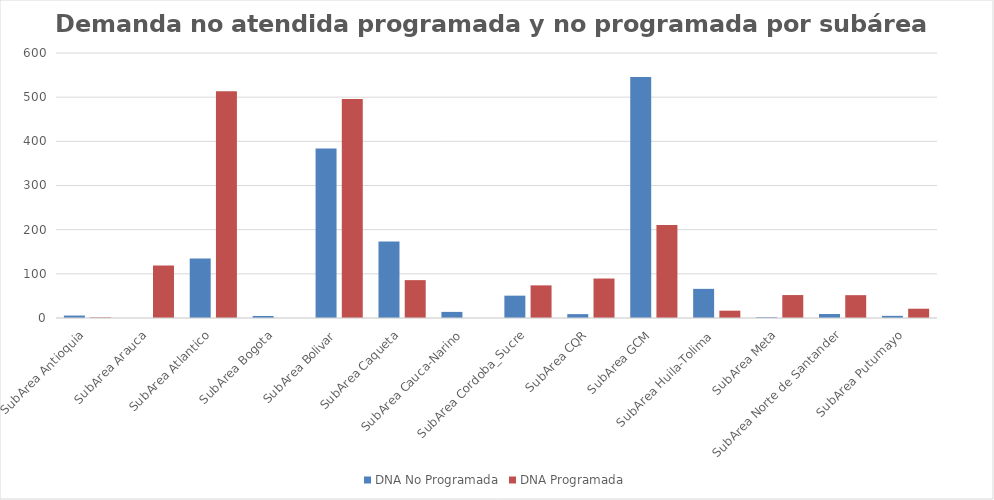
| Category | DNA No Programada | DNA Programada |
|---|---|---|
| SubArea Antioquia | 5.54 | 1.37 |
| SubArea Arauca | 0 | 118.94 |
| SubArea Atlantico | 134.89 | 513.29 |
| SubArea Bogota | 4.6 | 0 |
| SubArea Bolivar | 383.52 | 496.02 |
| SubArea Caqueta | 173.28 | 85.75 |
| SubArea Cauca-Narino | 13.81 | 0 |
| SubArea Cordoba_Sucre | 50.59 | 73.87 |
| SubArea CQR | 8.78 | 89.4 |
| SubArea GCM | 545.53 | 210.62 |
| SubArea Huila-Tolima | 65.98 | 16.6 |
| SubArea Meta | 1.86 | 51.91 |
| SubArea Norte de Santander | 8.97 | 51.72 |
| SubArea Putumayo | 4.87 | 21 |